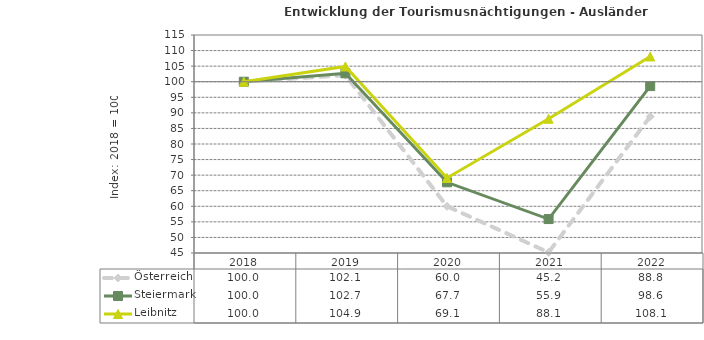
| Category | Österreich | Steiermark | Leibnitz |
|---|---|---|---|
| 2022.0 | 88.8 | 98.6 | 108.1 |
| 2021.0 | 45.2 | 55.9 | 88.1 |
| 2020.0 | 60 | 67.7 | 69.1 |
| 2019.0 | 102.1 | 102.7 | 104.9 |
| 2018.0 | 100 | 100 | 100 |